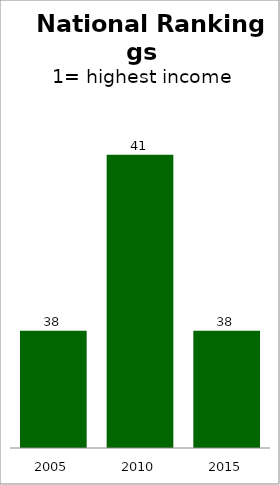
| Category | Series 0 |
|---|---|
| 2005.0 | 38 |
| 2010.0 | 41 |
| 2015.0 | 38 |